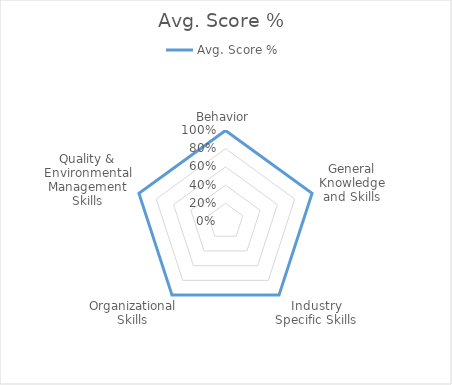
| Category | Avg. Score %  |
|---|---|
| Behavior | 1 |
| General Knowledge and Skills | 1 |
| Industry Specific Skills | 1 |
| Organizational Skills | 1 |
| Quality & Environmental Management Skills | 1 |